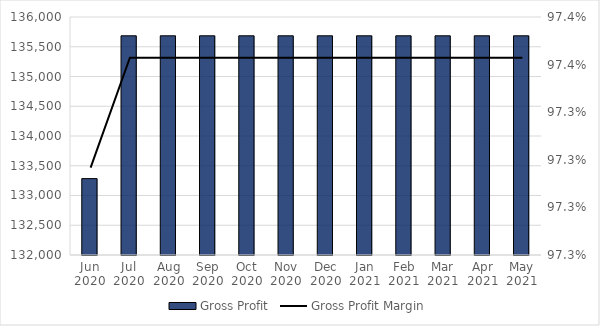
| Category | Gross Profit |
|---|---|
| Jun 2020 | 133283.85 |
| Jul 2020 | 135683.85 |
| Aug 2020 | 135683.85 |
| Sep 2020 | 135683.85 |
| Oct 2020 | 135683.85 |
| Nov 2020 | 135683.85 |
| Dec 2020 | 135683.85 |
| Jan 2021 | 135683.85 |
| Feb 2021 | 135683.85 |
| Mar 2021 | 135683.85 |
| Apr 2021 | 135683.85 |
| May 2021 | 135683.85 |